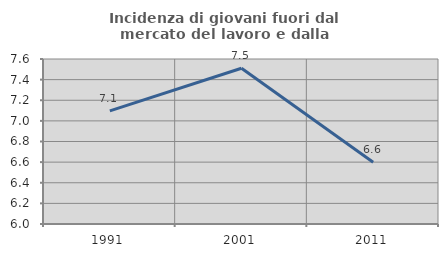
| Category | Incidenza di giovani fuori dal mercato del lavoro e dalla formazione  |
|---|---|
| 1991.0 | 7.097 |
| 2001.0 | 7.51 |
| 2011.0 | 6.599 |